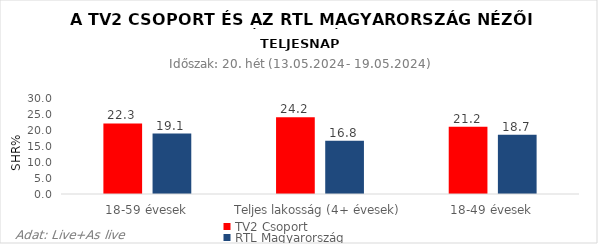
| Category | TV2 Csoport | RTL Magyarország |
|---|---|---|
| 18-59 évesek | 22.3 | 19.1 |
| Teljes lakosság (4+ évesek) | 24.2 | 16.8 |
| 18-49 évesek | 21.2 | 18.7 |